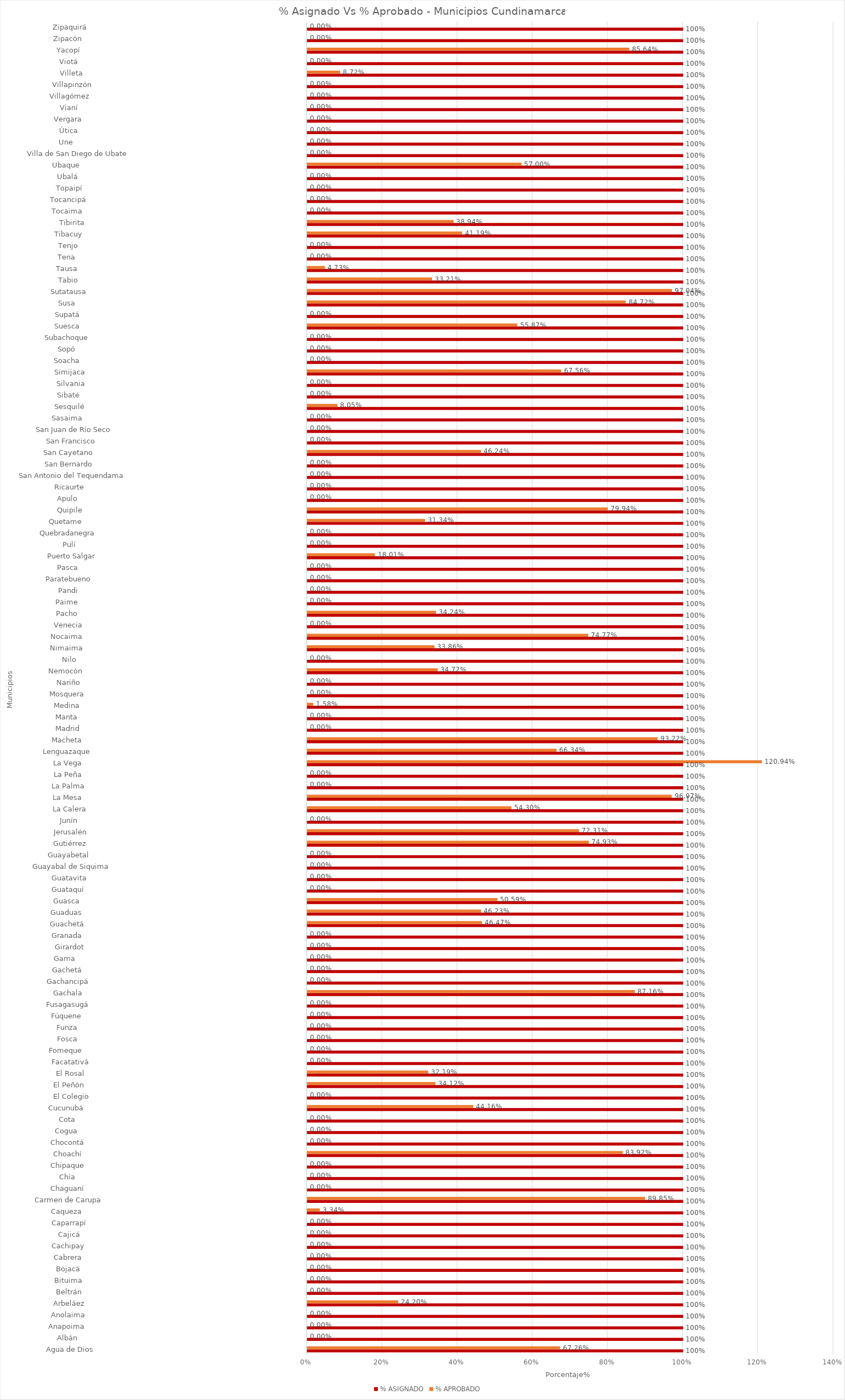
| Category | % ASIGNADO | % APROBADO |
|---|---|---|
| Agua de Dios                                                                                         | 1 | 0.673 |
| Albán                                                                                                | 1 | 0 |
| Anapoima                                                                                             | 1 | 0 |
| Anolaima                                                                                             | 1 | 0 |
| Arbeláez                                                                                             | 1 | 0.242 |
| Beltrán                                                                                              | 1 | 0 |
| Bituima                                                                                              | 1 | 0 |
| Bojacá                                                                                               | 1 | 0 |
| Cabrera                                                                                              | 1 | 0 |
| Cachipay                                                                                             | 1 | 0 |
| Cajicá                                                                                               | 1 | 0 |
| Caparrapí                                                                                            | 1 | 0 |
| Caqueza                                                                                              | 1 | 0.033 |
| Carmen de Carupa                                                                                     | 1 | 0.898 |
| Chaguaní                                                                                             | 1 | 0 |
| Chía                                                                                                 | 1 | 0 |
| Chipaque                                                                                             | 1 | 0 |
| Choachí                                                                                              | 1 | 0.839 |
| Chocontá                                                                                             | 1 | 0 |
| Cogua                                                                                                | 1 | 0 |
| Cota                                                                                                 | 1 | 0 |
| Cucunubá                                                                                             | 1 | 0.442 |
| El Colegio                                                                                           | 1 | 0 |
| El Peñón                                                                                             | 1 | 0.341 |
| El Rosal                                                                                             | 1 | 0.322 |
| Facatativá                                                                                           | 1 | 0 |
| Fomeque                                                                                              | 1 | 0 |
| Fosca                                                                                                | 1 | 0 |
| Funza                                                                                                | 1 | 0 |
| Fúquene                                                                                              | 1 | 0 |
| Fusagasugá                                                                                           | 1 | 0 |
| Gachala                                                                                              | 1 | 0.872 |
| Gachancipá                                                                                           | 1 | 0 |
| Gachetá                                                                                              | 1 | 0 |
| Gama                                                                                                 | 1 | 0 |
| Girardot                                                                                             | 1 | 0 |
| Granada                                                                                              | 1 | 0 |
| Guachetá                                                                                             | 1 | 0.465 |
| Guaduas                                                                                              | 1 | 0.462 |
| Guasca                                                                                               | 1 | 0.506 |
| Guataquí                                                                                             | 1 | 0 |
| Guatavita                                                                                            | 1 | 0 |
| Guayabal de Siquima                                                                                  | 1 | 0 |
| Guayabetal                                                                                           | 1 | 0 |
| Gutiérrez                                                                                            | 1 | 0.749 |
| Jerusalén                                                                                            | 1 | 0.723 |
| Junín                                                                                                | 1 | 0 |
| La Calera                                                                                            | 1 | 0.543 |
| La Mesa                                                                                              | 1 | 0.97 |
| La Palma                                                                                             | 1 | 0 |
| La Peña                                                                                              | 1 | 0 |
| La Vega                                                                                              | 1 | 1.209 |
| Lenguazaque                                                                                          | 1 | 0.663 |
| Macheta                                                                                              | 1 | 0.932 |
| Madrid                                                                                               | 1 | 0 |
| Manta                                                                                                | 1 | 0 |
| Medina                                                                                               | 1 | 0.016 |
| Mosquera                                                                                             | 1 | 0 |
| Nariño                                                                                               | 1 | 0 |
| Nemocón                                                                                              | 1 | 0.347 |
| Nilo                                                                                                 | 1 | 0 |
| Nimaima                                                                                              | 1 | 0.339 |
| Nocaima                                                                                              | 1 | 0.748 |
| Venecia                                                                                              | 1 | 0 |
| Pacho                                                                                                | 1 | 0.342 |
| Paime                                                                                                | 1 | 0 |
| Pandi                                                                                                | 1 | 0 |
| Paratebueno                                                                                          | 1 | 0 |
| Pasca                                                                                                | 1 | 0 |
| Puerto Salgar                                                                                        | 1 | 0.18 |
| Pulí                                                                                                 | 1 | 0 |
| Quebradanegra                                                                                        | 1 | 0 |
| Quetame                                                                                              | 1 | 0.313 |
| Quipile                                                                                              | 1 | 0.799 |
| Apulo                                                                                                | 1 | 0 |
| Ricaurte                                                                                             | 1 | 0 |
| San Antonio del Tequendama                                                                           | 1 | 0 |
| San Bernardo                                                                                         | 1 | 0 |
| San Cayetano                                                                                         | 1 | 0.462 |
| San Francisco                                                                                        | 1 | 0 |
| San Juan de Río Seco                                                                                 | 1 | 0 |
| Sasaima                                                                                              | 1 | 0 |
| Sesquilé                                                                                             | 1 | 0.08 |
| Sibaté                                                                                               | 1 | 0 |
| Silvania                                                                                             | 1 | 0 |
| Simijaca                                                                                             | 1 | 0.676 |
| Soacha                                                                                               | 1 | 0 |
| Sopó                                                                                                 | 1 | 0 |
| Subachoque                                                                                           | 1 | 0 |
| Suesca                                                                                               | 1 | 0.559 |
| Supatá                                                                                               | 1 | 0 |
| Susa                                                                                                 | 1 | 0.847 |
| Sutatausa                                                                                            | 1 | 0.97 |
| Tabio                                                                                                | 1 | 0.332 |
| Tausa                                                                                                | 1 | 0.047 |
| Tena                                                                                                 | 1 | 0 |
| Tenjo                                                                                                | 1 | 0 |
| Tibacuy                                                                                              | 1 | 0.412 |
| Tibirita                                                                                             | 1 | 0.389 |
| Tocaima                                                                                              | 1 | 0 |
| Tocancipá                                                                                            | 1 | 0 |
| Topaipí                                                                                              | 1 | 0 |
| Ubalá                                                                                                | 1 | 0 |
| Ubaque                                                                                               | 1 | 0.57 |
| Villa de San Diego de Ubate                                                                          | 1 | 0 |
| Une                                                                                                  | 1 | 0 |
| Útica                                                                                                | 1 | 0 |
| Vergara                                                                                              | 1 | 0 |
| Vianí                                                                                                | 1 | 0 |
| Villagómez                                                                                           | 1 | 0 |
| Villapinzón                                                                                          | 1 | 0 |
| Villeta                                                                                              | 1 | 0.087 |
| Viotá                                                                                                | 1 | 0 |
| Yacopí                                                                                               | 1 | 0.856 |
| Zipacón                                                                                              | 1 | 0 |
| Zipaquirá                                                                                            | 1 | 0 |